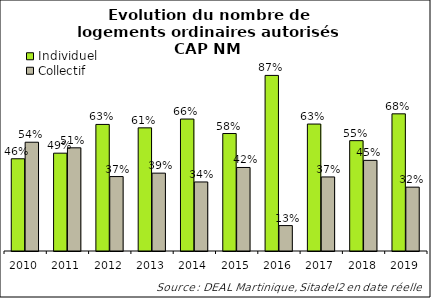
| Category | Individuel | Collectif |
|---|---|---|
| 2010.0 | 0.459 | 0.541 |
| 2011.0 | 0.487 | 0.513 |
| 2012.0 | 0.63 | 0.37 |
| 2013.0 | 0.613 | 0.387 |
| 2014.0 | 0.657 | 0.343 |
| 2015.0 | 0.584 | 0.416 |
| 2016.0 | 0.874 | 0.126 |
| 2017.0 | 0.632 | 0.368 |
| 2018.0 | 0.549 | 0.451 |
| 2019.0 | 0.682 | 0.318 |